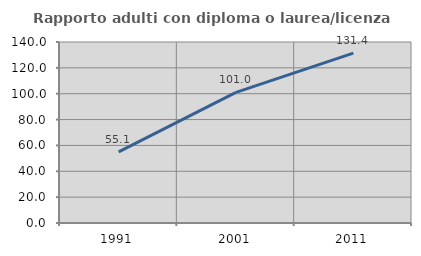
| Category | Rapporto adulti con diploma o laurea/licenza media  |
|---|---|
| 1991.0 | 55.056 |
| 2001.0 | 101.034 |
| 2011.0 | 131.377 |